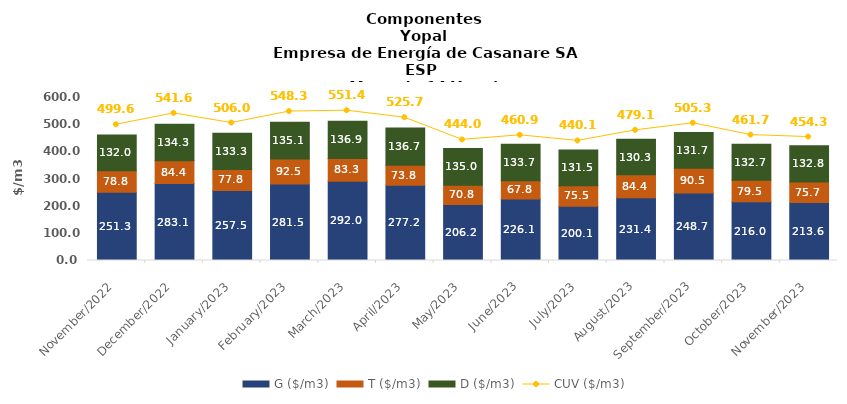
| Category | G ($/m3) | T ($/m3) | D ($/m3) |
|---|---|---|---|
| 2022-11-01 | 251.27 | 78.75 | 131.99 |
| 2022-12-01 | 283.07 | 84.41 | 134.3 |
| 2023-01-01 | 257.508 | 77.815 | 133.258 |
| 2023-02-01 | 281.451 | 92.545 | 135.074 |
| 2023-03-01 | 292.028 | 83.345 | 136.946 |
| 2023-04-01 | 277.158 | 73.848 | 136.749 |
| 2023-05-01 | 206.218 | 70.832 | 134.954 |
| 2023-06-01 | 226.097 | 67.766 | 133.705 |
| 2023-07-01 | 200.103 | 75.481 | 131.466 |
| 2023-08-01 | 231.393 | 84.415 | 130.283 |
| 2023-09-01 | 248.694 | 90.492 | 131.705 |
| 2023-10-01 | 216.024 | 79.542 | 132.704 |
| 2023-11-01 | 213.555 | 75.682 | 132.796 |